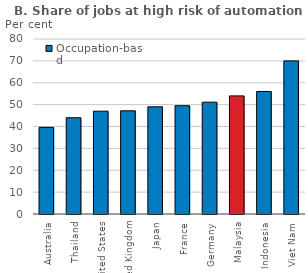
| Category | Occupation-based |
|---|---|
| Australia | 39.6 |
| Thailand | 44 |
| United States | 47 |
| United Kingdom | 47.17 |
| Japan | 49 |
| France | 49.5 |
| Germany | 51.12 |
| Malaysia | 54 |
| Indonesia | 56 |
| Viet Nam | 70 |